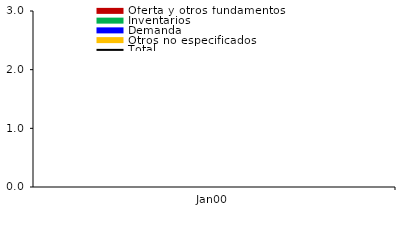
| Category | Oferta y otros fundamentos | Inventarios | Demanda | Otros no especificados |
|---|---|---|---|---|
|  | -0.892 | 0.246 | 0.205 | -0.667 |
|  | -0.41 | 0.401 | 0.214 | -0.595 |
|  | -0.224 | 0.242 | 0.18 | 0.042 |
|  | 0.49 | -0.311 | 0.054 | -0.25 |
|  | 0.099 | -0.647 | 0.103 | -0.387 |
|  | -0.334 | -0.593 | 0.119 | -0.404 |
|  | -0.197 | -0.282 | 0.112 | -0.028 |
|  | 0.146 | 0.051 | 0.078 | 0.053 |
|  | 0.629 | 0.254 | 0.377 | -0.084 |
|  | 0.788 | 0.59 | 0.571 | 0.526 |